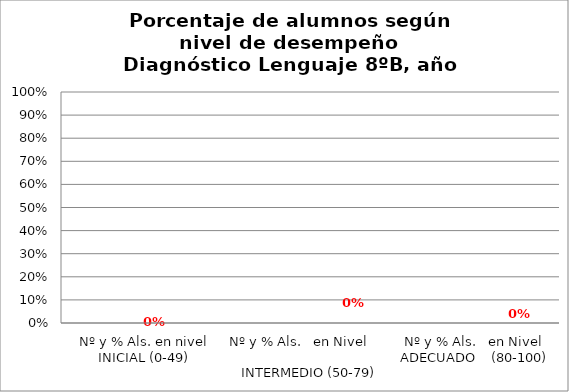
| Category | Series 0 | Series 1 | Series 2 | Series 3 |
|---|---|---|---|---|
| Nº y % Als. en nivel INICIAL (0-49) |  |  |  | 0 |
| Nº y % Als.   en Nivel                                          INTERMEDIO (50-79) |  |  |  | 0 |
| Nº y % Als.   en Nivel  ADECUADO    (80-100) |  |  |  | 0 |